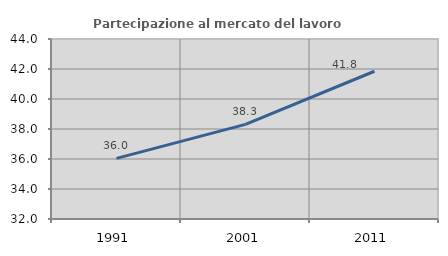
| Category | Partecipazione al mercato del lavoro  femminile |
|---|---|
| 1991.0 | 36.041 |
| 2001.0 | 38.305 |
| 2011.0 | 41.85 |